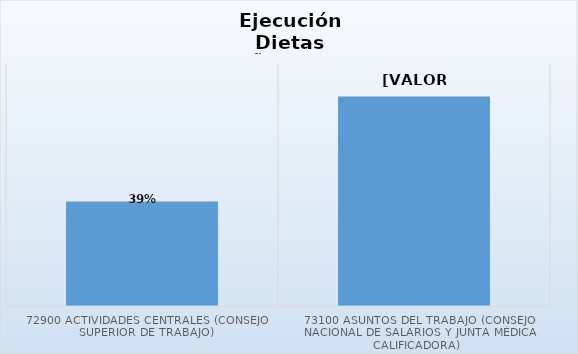
| Category | Series 0 |
|---|---|
| 72900 Actividades Centrales (Consejo Superior de Trabajo) | 0.389 |
| 73100 Asuntos del Trabajo (Consejo Nacional de Salarios y Junta Médica Calificadora) | 0.78 |